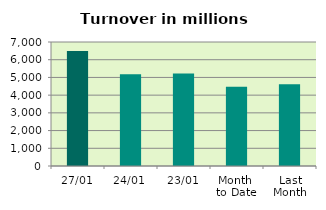
| Category | Series 0 |
|---|---|
| 27/01 | 6495.075 |
| 24/01 | 5176.996 |
| 23/01 | 5228.409 |
| Month 
to Date | 4468.887 |
| Last
Month | 4613.793 |